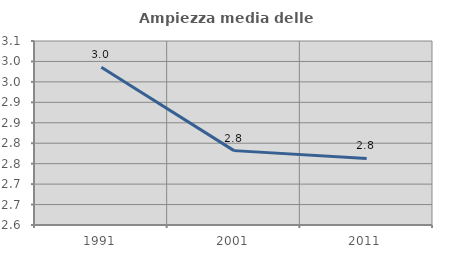
| Category | Ampiezza media delle famiglie |
|---|---|
| 1991.0 | 2.986 |
| 2001.0 | 2.782 |
| 2011.0 | 2.763 |